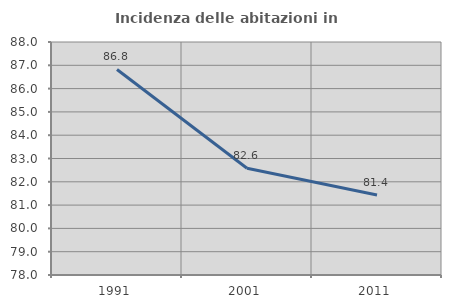
| Category | Incidenza delle abitazioni in proprietà  |
|---|---|
| 1991.0 | 86.822 |
| 2001.0 | 82.579 |
| 2011.0 | 81.435 |